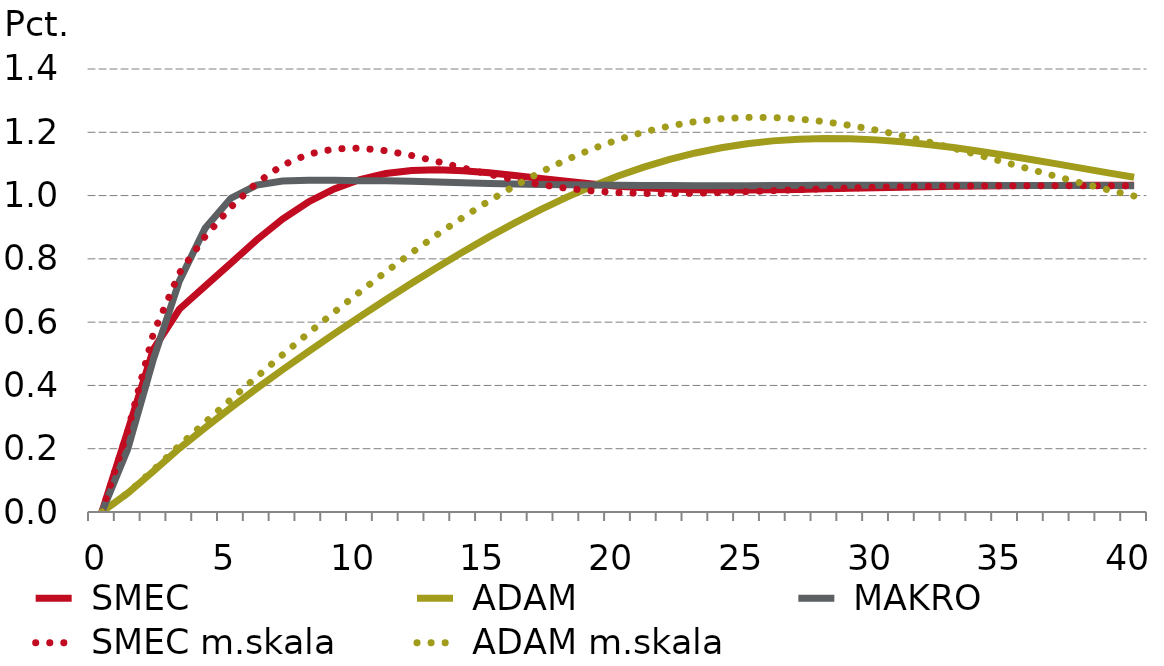
| Category |  SMEC |  ADAM |  MAKRO |  SMEC m.skala |  ADAM m.skala |
|---|---|---|---|---|---|
| 0.0 | 0 | 0 | 0 | 0 | 0 |
| nan | 0.256 | 0.059 | 0.199 | 0.256 | 0.06 |
| nan | 0.515 | 0.129 | 0.484 | 0.566 | 0.133 |
| nan | 0.641 | 0.201 | 0.73 | 0.755 | 0.21 |
| nan | 0.714 | 0.266 | 0.897 | 0.871 | 0.283 |
| 5.0 | 0.786 | 0.33 | 0.992 | 0.964 | 0.356 |
| nan | 0.86 | 0.391 | 1.033 | 1.04 | 0.427 |
| nan | 0.926 | 0.45 | 1.046 | 1.096 | 0.497 |
| nan | 0.98 | 0.507 | 1.048 | 1.131 | 0.565 |
| nan | 1.021 | 0.563 | 1.048 | 1.148 | 0.631 |
| 10.0 | 1.051 | 0.617 | 1.047 | 1.15 | 0.696 |
| nan | 1.07 | 0.671 | 1.047 | 1.142 | 0.759 |
| nan | 1.079 | 0.723 | 1.046 | 1.127 | 0.819 |
| nan | 1.082 | 0.774 | 1.043 | 1.108 | 0.877 |
| nan | 1.079 | 0.823 | 1.04 | 1.087 | 0.932 |
| 15.0 | 1.072 | 0.869 | 1.038 | 1.067 | 0.983 |
| nan | 1.064 | 0.914 | 1.036 | 1.05 | 1.031 |
| nan | 1.054 | 0.956 | 1.035 | 1.035 | 1.074 |
| nan | 1.045 | 0.994 | 1.034 | 1.023 | 1.113 |
| nan | 1.037 | 1.03 | 1.033 | 1.015 | 1.147 |
| 20.0 | 1.03 | 1.062 | 1.032 | 1.009 | 1.177 |
| nan | 1.024 | 1.09 | 1.032 | 1.007 | 1.201 |
| nan | 1.021 | 1.114 | 1.032 | 1.006 | 1.22 |
| nan | 1.018 | 1.135 | 1.031 | 1.007 | 1.234 |
| nan | 1.017 | 1.151 | 1.031 | 1.009 | 1.243 |
| 25.0 | 1.017 | 1.164 | 1.031 | 1.012 | 1.247 |
| nan | 1.018 | 1.173 | 1.032 | 1.015 | 1.247 |
| nan | 1.019 | 1.178 | 1.032 | 1.019 | 1.242 |
| nan | 1.021 | 1.181 | 1.032 | 1.022 | 1.234 |
| nan | 1.023 | 1.18 | 1.032 | 1.024 | 1.222 |
| 30.0 | 1.025 | 1.176 | 1.032 | 1.026 | 1.207 |
| nan | 1.027 | 1.17 | 1.033 | 1.028 | 1.19 |
| nan | 1.028 | 1.162 | 1.033 | 1.029 | 1.17 |
| nan | 1.029 | 1.152 | 1.033 | 1.03 | 1.149 |
| nan | 1.03 | 1.14 | 1.032 | 1.031 | 1.127 |
| 35.0 | 1.031 | 1.128 | 1.032 | 1.031 | 1.105 |
| nan | 1.032 | 1.114 | 1.032 | 1.031 | 1.082 |
| nan | 1.032 | 1.1 | 1.032 | 1.031 | 1.06 |
| nan | 1.032 | 1.086 | 1.032 | 1.031 | 1.038 |
| nan | 1.033 | 1.072 | 1.032 | 1.031 | 1.018 |
| 40.0 | 1.033 | 1.058 | 1.031 | 1.031 | 0.999 |